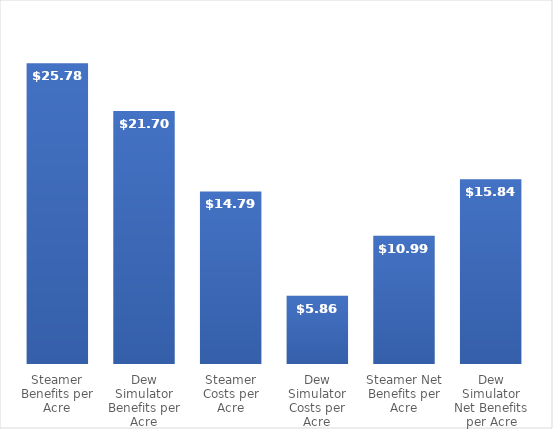
| Category | Series 0 |
|---|---|
| Steamer Benefits per Acre | 25.783 |
| Dew Simulator Benefits per Acre | 21.696 |
| Steamer Costs per Acre | 14.793 |
| Dew Simulator Costs per Acre | 5.86 |
| Steamer Net Benefits per Acre | 10.99 |
| Dew Simulator Net Benefits per Acre | 15.836 |